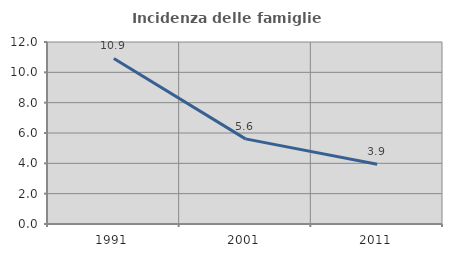
| Category | Incidenza delle famiglie numerose |
|---|---|
| 1991.0 | 10.917 |
| 2001.0 | 5.612 |
| 2011.0 | 3.944 |